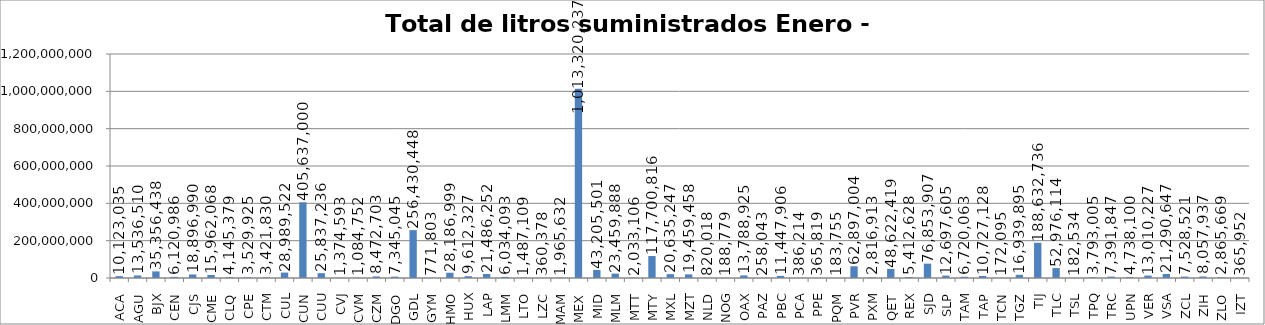
| Category | Total de litros suministrados Enero - Diciembre |
|---|---|
| ACA | 10123035 |
| AGU | 13536510 |
| BJX | 35356438 |
| CEN | 6120986 |
| CJS | 18896990 |
| CME | 15962068 |
| CLQ | 4145379 |
| CPE | 3529925 |
| CTM | 3421830 |
| CUL | 28989522 |
| CUN | 405637000 |
| CUU | 25837236 |
| CVJ | 1374593 |
| CVM | 1084752 |
| CZM | 8472703 |
| DGO | 7345045 |
| GDL | 256430448 |
| GYM | 771803 |
| HMO | 28186999 |
| HUX | 9612327 |
| LAP | 21486252 |
| LMM | 6034093 |
| LTO | 1487109 |
| LZC | 360378 |
| MAM | 1965632 |
| MEX | 1013320237 |
| MID | 43205501 |
| MLM | 23459888 |
| MTT | 2033106 |
| MTY | 117700816 |
| MXL | 20635247 |
| MZT | 19459458 |
| NLD | 820018 |
| NOG | 188779 |
| OAX | 13788925 |
| PAZ | 258043 |
| PBC | 11447906 |
| PCA | 386214 |
| PPE | 365819 |
| PQM | 183755 |
| PVR | 62897004 |
| PXM | 2816913 |
| QET | 48622419 |
| REX | 5412628 |
| SJD | 76853907 |
| SLP | 12697605 |
| TAM | 6720063 |
| TAP | 10727128 |
| TCN | 172095 |
| TGZ | 16939895 |
| TIJ | 188632736 |
| TLC | 52976114 |
| TSL | 182534 |
| TPQ | 3793005 |
| TRC | 7391847 |
| UPN | 4738100 |
| VER | 13010227 |
| VSA | 21290647 |
| ZCL | 7528521 |
| ZIH | 8057937 |
| ZLO | 2865669 |
| IZT | 365952 |